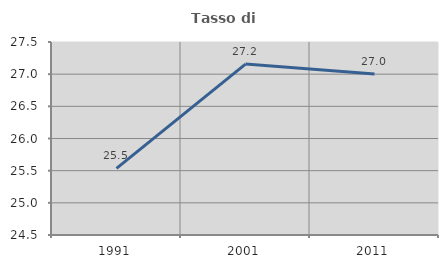
| Category | Tasso di occupazione   |
|---|---|
| 1991.0 | 25.536 |
| 2001.0 | 27.157 |
| 2011.0 | 27.002 |